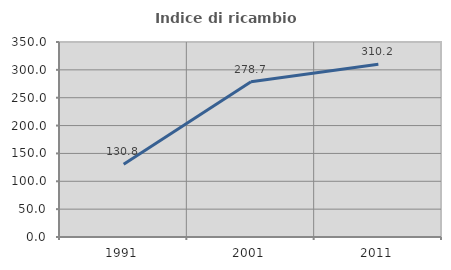
| Category | Indice di ricambio occupazionale  |
|---|---|
| 1991.0 | 130.769 |
| 2001.0 | 278.723 |
| 2011.0 | 310.169 |